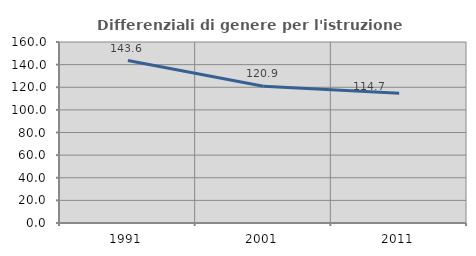
| Category | Differenziali di genere per l'istruzione superiore |
|---|---|
| 1991.0 | 143.566 |
| 2001.0 | 120.856 |
| 2011.0 | 114.722 |